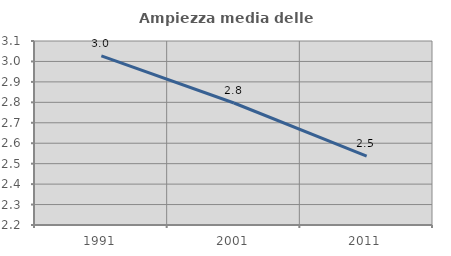
| Category | Ampiezza media delle famiglie |
|---|---|
| 1991.0 | 3.027 |
| 2001.0 | 2.797 |
| 2011.0 | 2.537 |